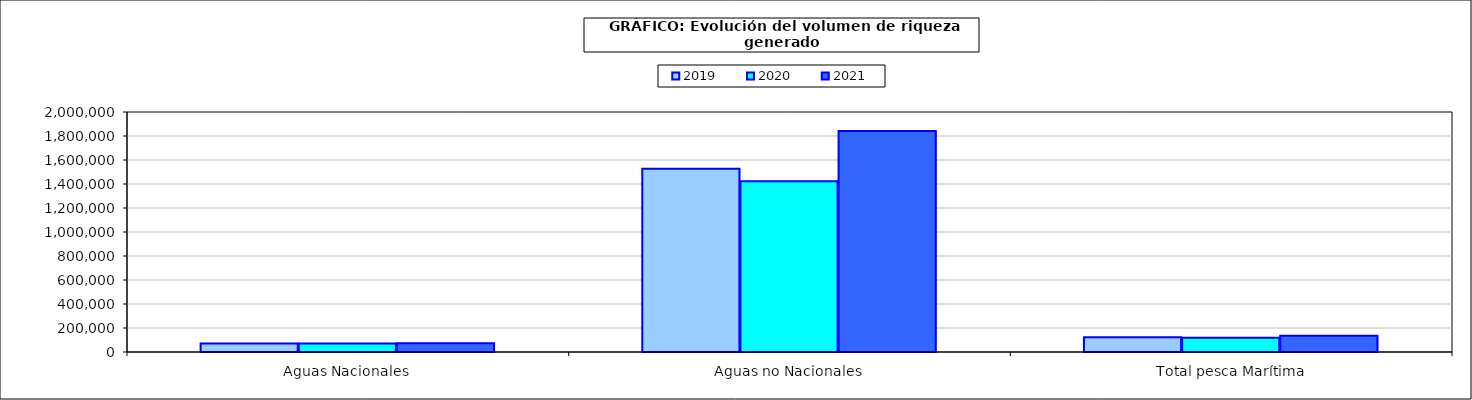
| Category | 2019 | 2020 | 2021 |
|---|---|---|---|
| 0 | 71713.906 | 70812.188 | 73538.055 |
| 1 | 1527052.017 | 1423788.088 | 1840717.743 |
| 2 | 123662.367 | 118667.24 | 135183.858 |